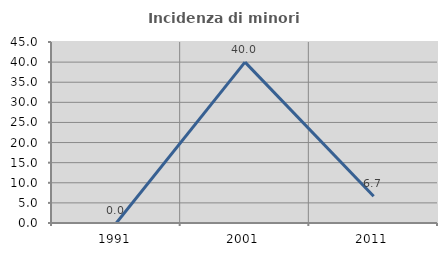
| Category | Incidenza di minori stranieri |
|---|---|
| 1991.0 | 0 |
| 2001.0 | 40 |
| 2011.0 | 6.667 |